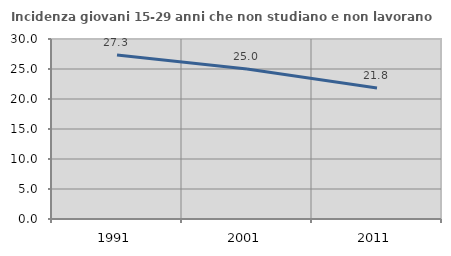
| Category | Incidenza giovani 15-29 anni che non studiano e non lavorano  |
|---|---|
| 1991.0 | 27.345 |
| 2001.0 | 25 |
| 2011.0 | 21.818 |